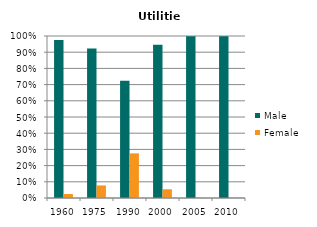
| Category | Male | Female |
|---|---|---|
| 1960.0 | 0.975 | 0.025 |
| 1975.0 | 0.922 | 0.078 |
| 1990.0 | 0.725 | 0.275 |
| 2000.0 | 0.946 | 0.054 |
| 2005.0 | 0.998 | 0.002 |
| 2010.0 | 0.998 | 0.002 |